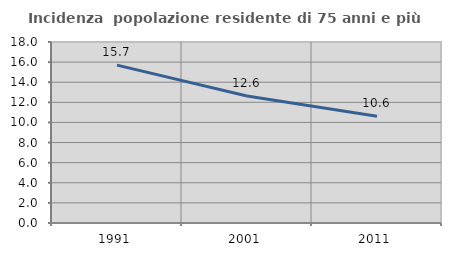
| Category | Incidenza  popolazione residente di 75 anni e più |
|---|---|
| 1991.0 | 15.704 |
| 2001.0 | 12.635 |
| 2011.0 | 10.618 |